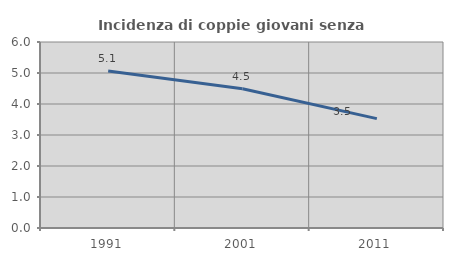
| Category | Incidenza di coppie giovani senza figli |
|---|---|
| 1991.0 | 5.067 |
| 2001.0 | 4.491 |
| 2011.0 | 3.528 |